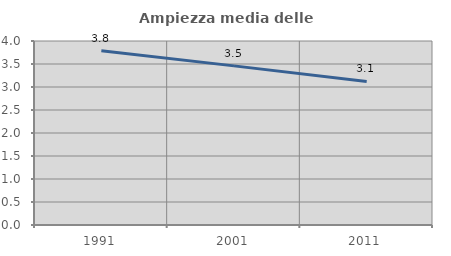
| Category | Ampiezza media delle famiglie |
|---|---|
| 1991.0 | 3.789 |
| 2001.0 | 3.459 |
| 2011.0 | 3.122 |